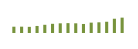
| Category | Saldo [ (1)-(2) ] |
|---|---|
| 0 | 203117.024 |
| 1 | 204244.864 |
| 2 | 198400.412 |
| 3 | 227324.117 |
| 4 | 264760.339 |
| 5 | 296419.004 |
| 6 | 312165.442 |
| 7 | 318321.614 |
| 8 | 312463.312 |
| 9 | 291587.274 |
| 10 | 334649.348 |
| 11 | 344816.778 |
| 12 | 363008.511 |
| 13 | 460327.444 |
| 14 | 495580.342 |